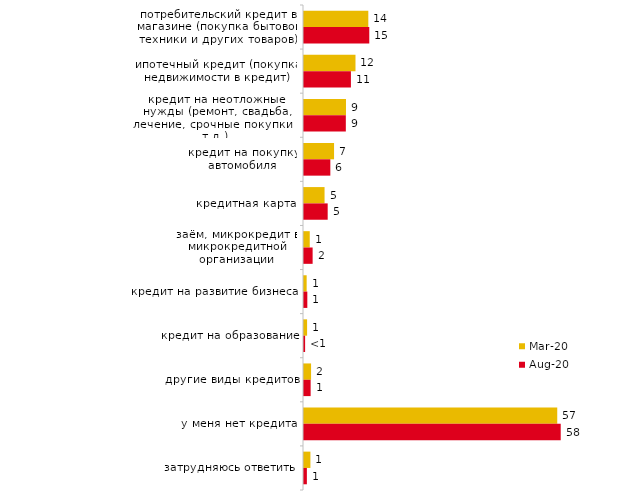
| Category | мар.20 | авг.20 |
|---|---|---|
| потребительский кредит в магазине (покупка бытовой техники и других товаров) | 14.427 | 14.647 |
| ипотечный кредит (покупка недвижимости в кредит) | 11.552 | 10.526 |
| кредит на неотложные нужды (ремонт, свадьба, лечение, срочные покупки и т.д.) | 9.42 | 9.384 |
| кредит на покупку автомобиля | 6.743 | 5.909 |
| кредитная карта | 4.611 | 5.313 |
| заём, микрокредит в микрокредитной организации | 1.289 | 1.936 |
| кредит на развитие бизнеса | 0.595 | 0.745 |
| кредит на образование | 0.694 | 0.248 |
| другие виды кредитов | 1.587 | 1.49 |
| у меня нет кредита | 56.817 | 57.597 |
| затрудняюсь ответить | 1.438 | 0.645 |